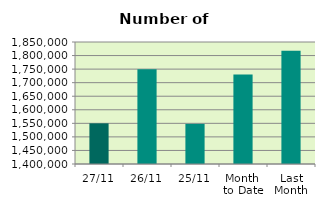
| Category | Series 0 |
|---|---|
| 27/11 | 1549938 |
| 26/11 | 1749218 |
| 25/11 | 1548110 |
| Month 
to Date | 1730375.158 |
| Last
Month | 1817802.609 |